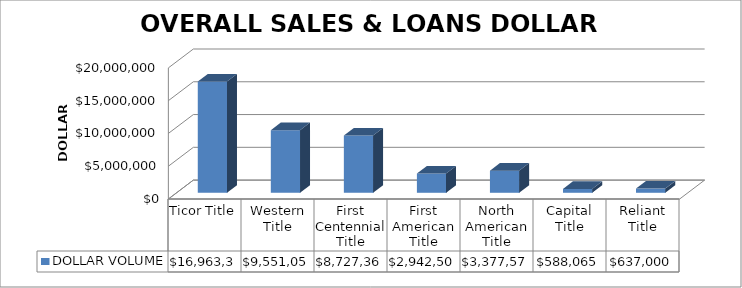
| Category | DOLLAR VOLUME |
|---|---|
| Ticor Title | 16963354.3 |
| Western Title | 9551052.52 |
| First Centennial Title | 8727368 |
| First American Title | 2942500 |
| North American Title | 3377579 |
| Capital Title | 588065 |
| Reliant Title | 637000 |